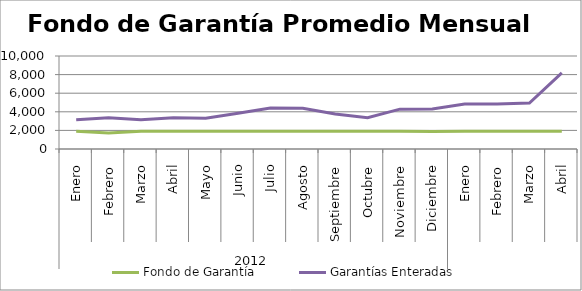
| Category | Fondo de Garantía | Garantías Enteradas |
|---|---|---|
| 0 | 1896.798 | 3141.641 |
| 1 | 1714.423 | 3362.648 |
| 2 | 1900.513 | 3154.118 |
| 3 | 1900.513 | 3348.058 |
| 4 | 1898.685 | 3308.859 |
| 5 | 1900.513 | 3850.375 |
| 6 | 1900.513 | 4400.539 |
| 7 | 1895.388 | 4383.327 |
| 8 | 1900.513 | 3757.632 |
| 9 | 1900.513 | 3362.932 |
| 10 | 1900.311 | 4285.609 |
| 11 | 1890.98 | 4296.87 |
| 12 | 1898.667 | 4842.786 |
| 13 | 1900.512 | 4845.136 |
| 14 | 1900.513 | 4938.365 |
| 15 | 1900.513 | 8179.666 |